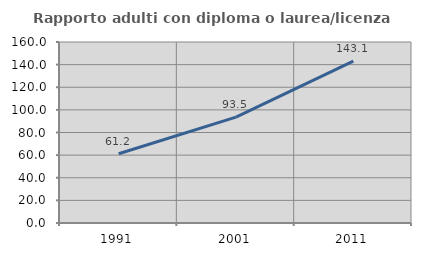
| Category | Rapporto adulti con diploma o laurea/licenza media  |
|---|---|
| 1991.0 | 61.227 |
| 2001.0 | 93.538 |
| 2011.0 | 143.06 |